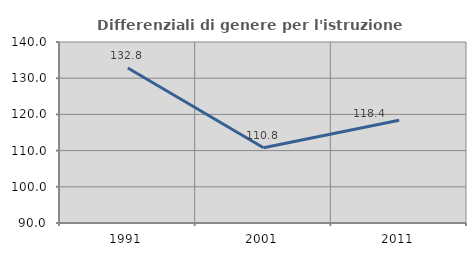
| Category | Differenziali di genere per l'istruzione superiore |
|---|---|
| 1991.0 | 132.84 |
| 2001.0 | 110.772 |
| 2011.0 | 118.396 |